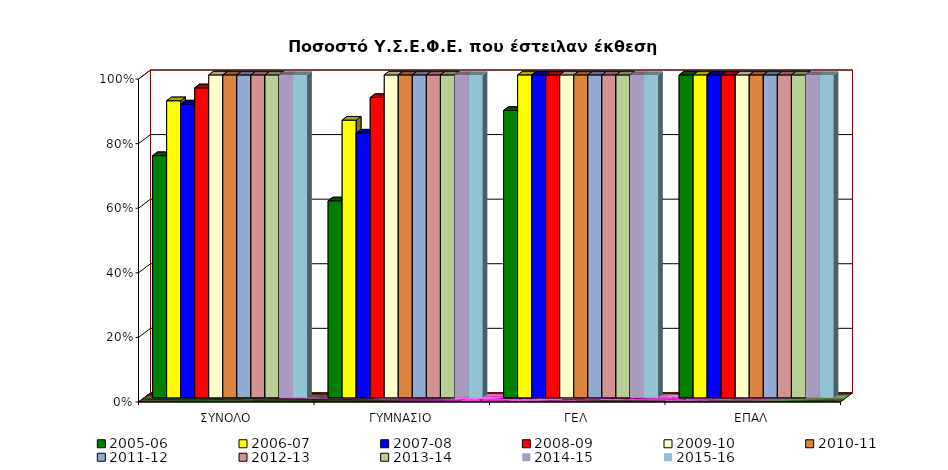
| Category | 2005-06 | 2006-07 | 2007-08 | 2008-09 | 2009-10 | 2010-11 | 2011-12 | 2012-13 | 2013-14 | 2014-15 | 2015-16 |
|---|---|---|---|---|---|---|---|---|---|---|---|
| ΣΥΝΟΛΟ | 0.75 | 0.92 | 0.91 | 0.96 | 1 | 1 | 1 | 1 | 1 | 1 | 1 |
| ΓΥΜΝΑΣΙΟ | 0.61 | 0.86 | 0.82 | 0.93 | 1 | 1 | 1 | 1 | 1 | 1 | 1 |
| ΓΕΛ | 0.89 | 1 | 1 | 1 | 1 | 1 | 1 | 1 | 1 | 1 | 1 |
| ΕΠΑΛ | 1 | 1 | 1 | 1 | 1 | 1 | 1 | 1 | 1 | 1 | 1 |